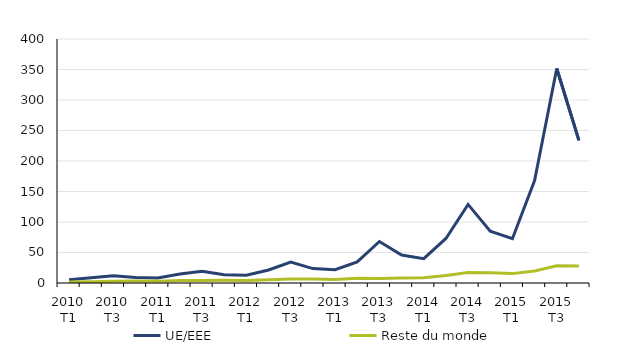
| Category | UE/EEE | Reste du monde |
|---|---|---|
| 2010 T1 | 5.277 | 1.501 |
| 2010 T2 | 8.7 | 2.034 |
| 2010 T3 | 12.005 | 2.825 |
| 2010 T4 | 8.857 | 3.207 |
| 2011 T1 | 8.354 | 3.02 |
| 2011 T2 | 14.612 | 3.918 |
| 2011 T3 | 19.162 | 3.895 |
| 2011 T4 | 13.635 | 4.366 |
| 2012 T1 | 12.588 | 4.086 |
| 2012 T2 | 21.3 | 5.134 |
| 2012 T3 | 34.327 | 6.403 |
| 2012 T4 | 23.663 | 6.488 |
| 2013 T1 | 21.88 | 5.777 |
| 2013 T2 | 34.532 | 7.657 |
| 2013 T3 | 68.012 | 7.409 |
| 2013 T4 | 45.829 | 8.147 |
| 2014 T1 | 39.851 | 8.548 |
| 2014 T2 | 73.005 | 12.315 |
| 2014 T3 | 128.849 | 17.039 |
| 2014 T4 | 85.07 | 16.834 |
| 2015 T1 | 72.621 | 15.382 |
| 2015 T2 | 168.039 | 19.807 |
| 2015 T3 | 351.689 | 28.28 |
| 2015 T4 | 233.804 | 27.83 |